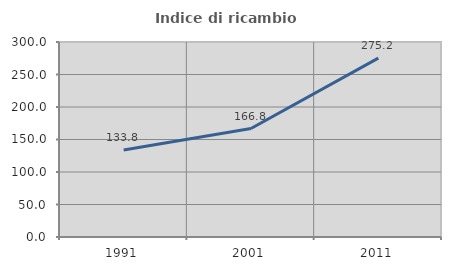
| Category | Indice di ricambio occupazionale  |
|---|---|
| 1991.0 | 133.803 |
| 2001.0 | 166.848 |
| 2011.0 | 275.188 |